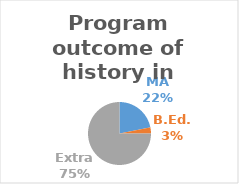
| Category | Series 0 |
|---|---|
| MA | 7 |
| B.Ed. | 1 |
| Extra | 24 |